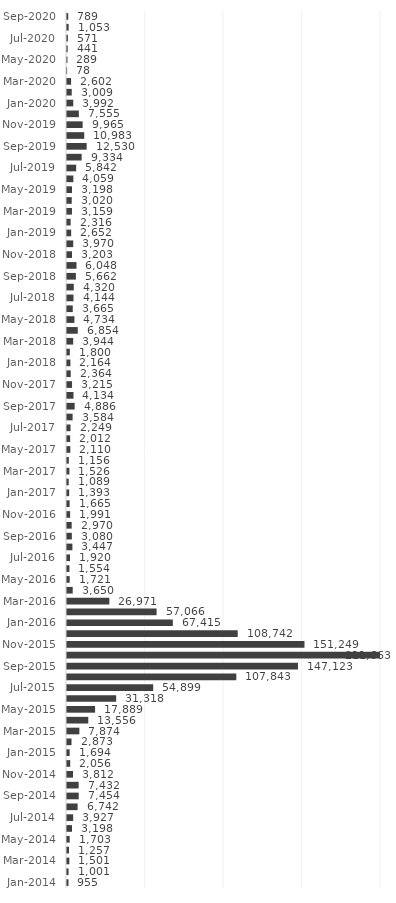
| Category | Series 0 |
|---|---|
| Jan-2014 | 955 |
| Feb-2014 | 1001 |
| Mar-2014 | 1501 |
| Apr-2014 | 1257 |
| May-2014 | 1703 |
| Jun-2014 | 3198 |
| Jul-2014 | 3927 |
| Aug-2014 | 6742 |
| Sep-2014 | 7454 |
| Oct-2014 | 7432 |
| Nov-2014 | 3812 |
| Dec-2014 | 2056 |
| Jan-2015 | 1694 |
| Feb-2015 | 2873 |
| Mar-2015 | 7874 |
| Apr-2015 | 13556 |
| May-2015 | 17889 |
| Jun-2015 | 31318 |
| Jul-2015 | 54899 |
| Aug-2015 | 107843 |
| Sep-2015 | 147123 |
| Oct-2015 | 211663 |
| Nov-2015 | 151249 |
| Dec-2015 | 108742 |
| Jan-2016 | 67415 |
| Feb-2016 | 57066 |
| Mar-2016 | 26971 |
| Apr-2016 | 3650 |
| May-2016 | 1721 |
| Jun-2016 | 1554 |
| Jul-2016 | 1920 |
| Aug-2016 | 3447 |
| Sep-2016 | 3080 |
| Oct-2016 | 2970 |
| Nov-2016 | 1991 |
| Dec-2016 | 1665 |
| Jan-2017 | 1393 |
| Feb-2017 | 1089 |
| Mar-2017 | 1526 |
| Apr-2017 | 1156 |
| May-2017 | 2110 |
| Jun-2017 | 2012 |
| Jul-2017 | 2249 |
| Aug-2017 | 3584 |
| Sep-2017 | 4886 |
| Oct-2017 | 4134 |
| Nov-2017 | 3215 |
| Dec-2017 | 2364 |
| Jan-2018 | 2164 |
| Feb-2018 | 1800 |
| Mar-2018 | 3944 |
| Apr-2018 | 6854 |
| May-2018 | 4734 |
| Jun-2018 | 3665 |
| Jul-2018 | 4144 |
| Aug-2018 | 4320 |
| Sep-2018 | 5662 |
| Oct-2018 | 6048 |
| Nov-2018 | 3203 |
| Dec-2018 | 3970 |
| Jan-2019 | 2652 |
| Feb-2019 | 2316 |
| Mar-2019 | 3159 |
| Apr-2019 | 3020 |
| May-2019 | 3198 |
| Jun-2019 | 4059 |
| Jul-2019 | 5842 |
| Aug-2019 | 9334 |
| Sep-2019 | 12530 |
| Oct-2019 | 10983 |
| Nov-2019 | 9965 |
| Dec-2019 | 7555 |
| Jan-2020 | 3992 |
| Feb-2020 | 3009 |
| Mar-2020 | 2602 |
| Apr-2020 | 78 |
| May-2020 | 289 |
| Jun-2020 | 441 |
| Jul-2020 | 571 |
| Aug-2020 | 1053 |
| Sep-2020 | 789 |